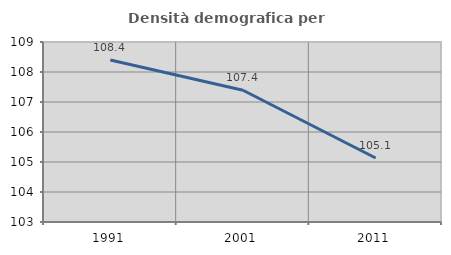
| Category | Densità demografica |
|---|---|
| 1991.0 | 108.4 |
| 2001.0 | 107.392 |
| 2011.0 | 105.134 |